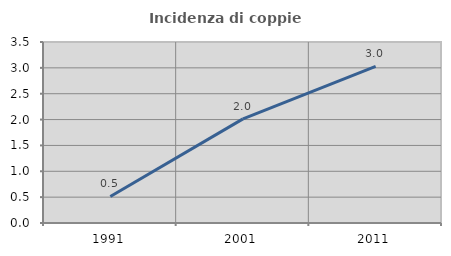
| Category | Incidenza di coppie miste |
|---|---|
| 1991.0 | 0.512 |
| 2001.0 | 2.014 |
| 2011.0 | 3.028 |